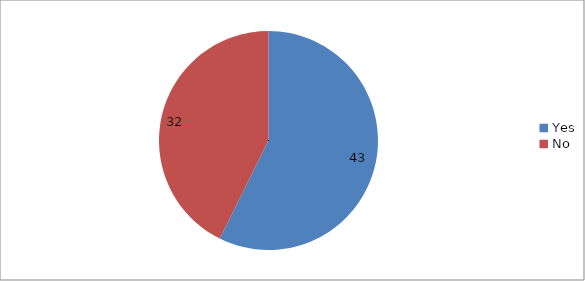
| Category | Series 0 |
|---|---|
| Yes | 43 |
| No | 32 |